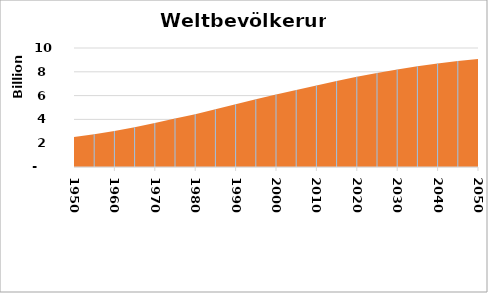
| Category | Series 0 |
|---|---|
| 1950-01-01 | 2519470000 |
| 1955-01-01 | 2757399000 |
| 1960-01-01 | 3023812000 |
| 1965-01-01 | 3337974000 |
| 1970-01-01 | 3696588000 |
| 1975-01-01 | 4073740000 |
| 1980-01-01 | 4442295000 |
| 1985-01-01 | 4843947000 |
| 1990-01-01 | 5279519000 |
| 1995-01-01 | 5692353000 |
| 2000-01-01 | 6085572000 |
| 2005-01-01 | 6464750000 |
| 2010-01-01 | 6842923000 |
| 2015-01-01 | 7219431000 |
| 2020-01-01 | 7577889000 |
| 2025-01-01 | 7905239000 |
| 2030-01-01 | 8199104000 |
| 2035-01-01 | 8463265000 |
| 2040-01-01 | 8701319000 |
| 2045-01-01 | 8907417000 |
| 2050-01-01 | 9075903000 |